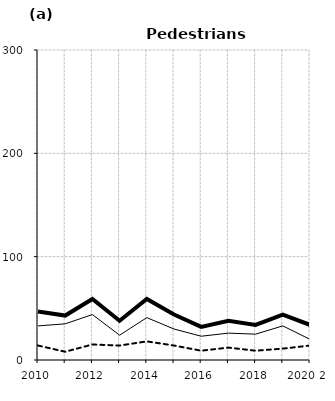
| Category | Built-up | Non built-up | Total |
|---|---|---|---|
| 2010 | 33 | 14 | 47 |
| 2011 | 35 | 8 | 43 |
| 2012 | 44 | 15 | 59 |
| 2013 | 24 | 14 | 38 |
| 2014 | 41 | 18 | 59 |
| 2015 | 30 | 14 | 44 |
| 2016 | 23 | 9 | 32 |
| 2017 | 26 | 12 | 38 |
| 2018 | 25 | 9 | 34 |
| 2019 2 | 33 | 11 | 44 |
| 2020 2 | 20 | 14 | 34 |